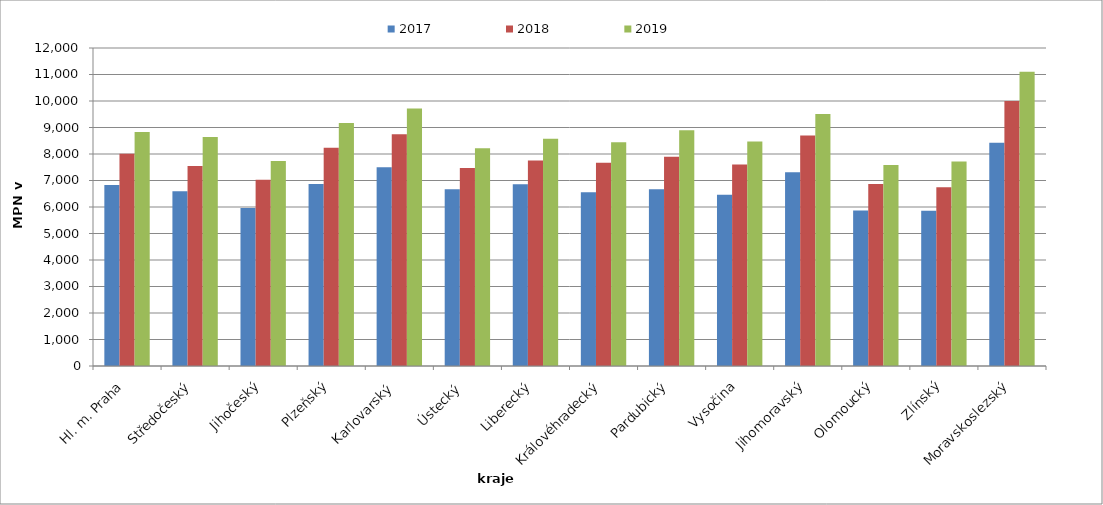
| Category | 2017 | 2018 | 2019 |
|---|---|---|---|
| Hl. m. Praha | 6826.855 | 8009.894 | 8828.269 |
| Středočeský | 6593.902 | 7547.562 | 8639.108 |
| Jihočeský | 5964.423 | 7032.125 | 7735.202 |
| Plzeňský | 6866.693 | 8240.032 | 9168.325 |
| Karlovarský  | 7501.349 | 8742.58 | 9713.977 |
| Ústecký   | 6668.343 | 7468.343 | 8215.314 |
| Liberecký | 6857.487 | 7756.907 | 8580.186 |
| Královéhradecký | 6557.867 | 7672.7 | 8440.105 |
| Pardubický | 6670.856 | 7894.512 | 8893.278 |
| Vysočina | 6461.897 | 7599.269 | 8473.167 |
| Jihomoravský | 7312.723 | 8696.314 | 9507.253 |
| Olomoucký | 5869.148 | 6866.84 | 7587.644 |
| Zlínský | 5862.51 | 6749.747 | 7713.274 |
| Moravskoslezský | 8422.554 | 9999.219 | 11101.125 |